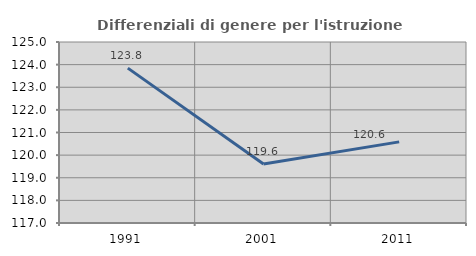
| Category | Differenziali di genere per l'istruzione superiore |
|---|---|
| 1991.0 | 123.846 |
| 2001.0 | 119.611 |
| 2011.0 | 120.585 |